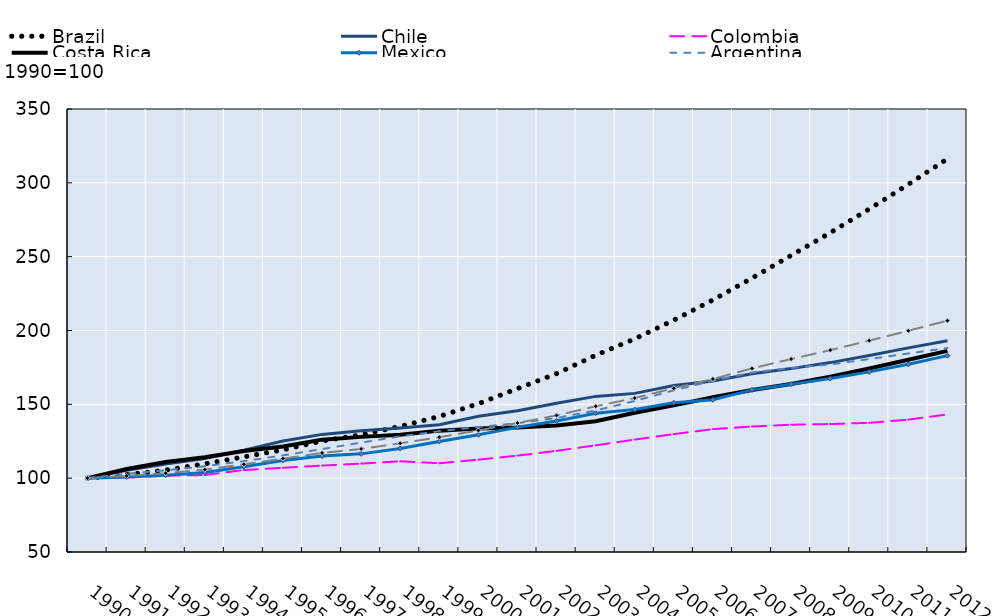
| Category | Brazil | Chile | Colombia | Costa Rica | Mexico | Argentina | Latin America and Caribbean |
|---|---|---|---|---|---|---|---|
| 1990.0 | 100 | 100 | 100 | 100 | 100 | 100 | 100 |
| 1991.0 | 102.417 | 105.28 | 100.432 | 106.158 | 100.819 | 102.978 | 101.495 |
| 1992.0 | 105.442 | 109.566 | 101.659 | 110.996 | 102.039 | 105.306 | 103.34 |
| 1993.0 | 109.707 | 113.353 | 102.139 | 114.236 | 103.855 | 108.059 | 105.787 |
| 1994.0 | 114.413 | 118.902 | 105.512 | 118.464 | 107.703 | 111.539 | 109.426 |
| 1995.0 | 119.19 | 125.121 | 107.027 | 121.424 | 112.024 | 115.418 | 113.209 |
| 1996.0 | 125.161 | 129.648 | 108.517 | 126.09 | 114.968 | 119.728 | 117.071 |
| 1997.0 | 129.391 | 132.183 | 109.864 | 127.964 | 116.458 | 124.076 | 119.786 |
| 1998.0 | 135.05 | 133.947 | 111.436 | 129.431 | 120.096 | 128.312 | 123.605 |
| 1999.0 | 141.797 | 136.167 | 110.101 | 132.189 | 124.894 | 131.825 | 127.716 |
| 2000.0 | 150.467 | 141.985 | 112.513 | 133.691 | 129.408 | 134.608 | 132.336 |
| 2001.0 | 160.637 | 145.602 | 115.274 | 134.318 | 134.444 | 137.253 | 137.375 |
| 2002.0 | 170.828 | 150.727 | 118.498 | 135.63 | 138.721 | 140.751 | 142.498 |
| 2003.0 | 183.238 | 155.379 | 122.235 | 138.603 | 143.989 | 145.809 | 148.653 |
| 2004.0 | 194.361 | 157.42 | 126.131 | 144.268 | 146.484 | 152.294 | 154.248 |
| 2005.0 | 207.027 | 162.772 | 129.844 | 149.282 | 151.038 | 159.497 | 160.921 |
| 2006.0 | 220.675 | 165.765 | 133.218 | 154.805 | 153.095 | 165.917 | 167.129 |
| 2007.0 | 235.499 | 170.755 | 134.962 | 159.671 | 159.793 | 171.536 | 174.35 |
| 2008.0 | 250.813 | 174.191 | 136.197 | 163.812 | 163.673 | 174.656 | 180.664 |
| 2009.0 | 266.177 | 178.257 | 136.646 | 168.683 | 167.543 | 177.015 | 186.683 |
| 2010.0 | 282.292 | 183.106 | 137.494 | 174.234 | 171.99 | 180.641 | 193.143 |
| 2011.0 | 298.998 | 188.23 | 139.637 | 180.174 | 177.107 | 184.452 | 199.822 |
| 2012.0 | 316.263 | 193.063 | 143.184 | 186.219 | 182.965 | 188.112 | 206.664 |